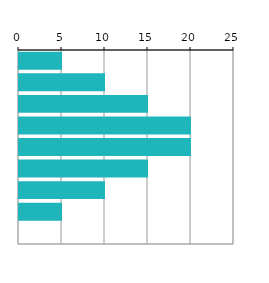
| Category | Series 0 |
|---|---|
| 1100.0 | 5 |
| 990.0 | 10 |
| 880.0 | 15 |
| 770.0 | 20 |
| 660.0 | 20 |
| 550.0 | 15 |
| 440.0 | 10 |
| 330.0 | 5 |
| 220.0 | 0 |